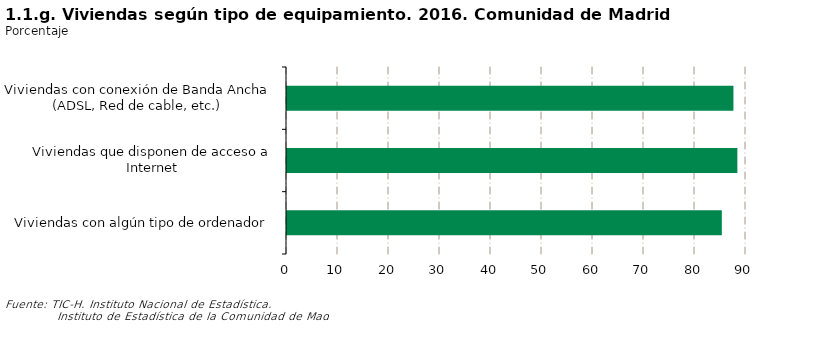
| Category | Series 0 |
|---|---|
| Viviendas con algún tipo de ordenador | 85.259 |
| Viviendas que disponen de acceso a Internet | 88.307 |
| Viviendas con conexión de Banda Ancha (ADSL, Red de cable, etc.) | 87.535 |